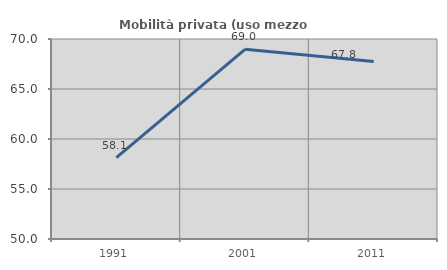
| Category | Mobilità privata (uso mezzo privato) |
|---|---|
| 1991.0 | 58.131 |
| 2001.0 | 68.97 |
| 2011.0 | 67.76 |